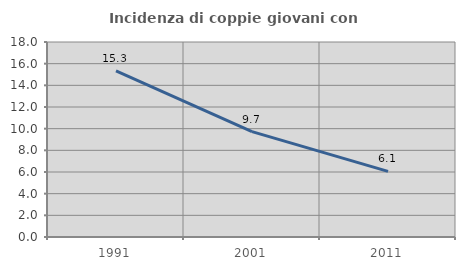
| Category | Incidenza di coppie giovani con figli |
|---|---|
| 1991.0 | 15.337 |
| 2001.0 | 9.726 |
| 2011.0 | 6.059 |